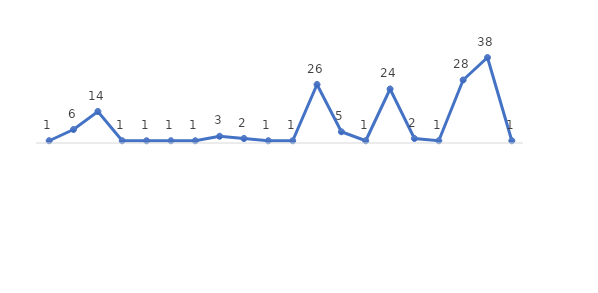
| Category | Total |
|---|---|
| Becas | 1 |
| Caja | 6 |
| Ciencias Basicas | 14 |
| DTE | 1 |
| Educación Permanente  | 1 |
| Egresados  | 1 |
| Finanzas | 1 |
| ILS | 3 |
| Mecatronica | 2 |
| Multimedia | 1 |
| Permanente | 1 |
| Registro | 26 |
| Residencia Academica | 5 |
| Servicios Generales | 1 |
| Software | 24 |
| Sonido | 2 |
| Tecnología Educativa | 1 |
| Transporte  | 28 |
| Vicerrectoría Académica | 38 |
| Vicerrectoria administrativa | 1 |